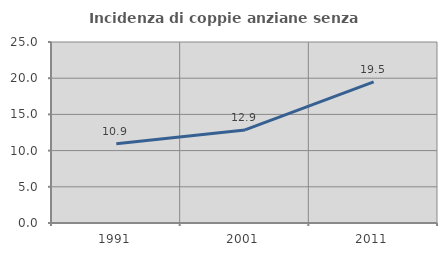
| Category | Incidenza di coppie anziane senza figli  |
|---|---|
| 1991.0 | 10.932 |
| 2001.0 | 12.857 |
| 2011.0 | 19.501 |